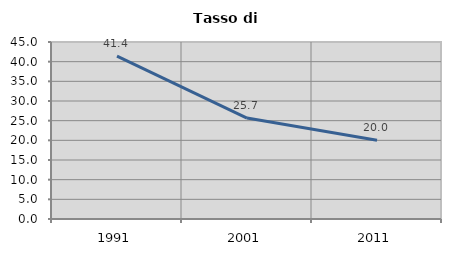
| Category | Tasso di disoccupazione   |
|---|---|
| 1991.0 | 41.409 |
| 2001.0 | 25.661 |
| 2011.0 | 20.017 |